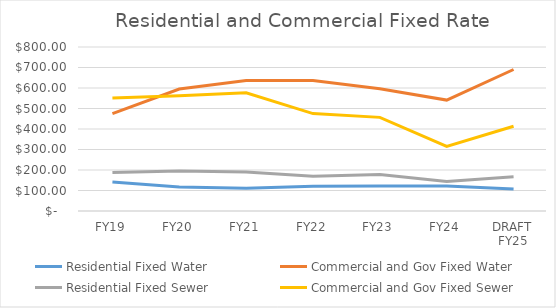
| Category | Residential Fixed Water | Commercial and Gov Fixed Water | Residential Fixed Sewer | Commercial and Gov Fixed Sewer |
|---|---|---|---|---|
| FY19 | 141.2 | 475.04 | 187.28 | 551.49 |
| FY20 | 116.517 | 594.717 | 194.637 | 562.561 |
| FY21 | 111.329 | 636.57 | 190.661 | 577.076 |
| FY22 | 120.447 | 636.618 | 169.72 | 475.045 |
| FY23 | 122.065 | 596.068 | 177.462 | 456.697 |
| FY24 | 121.869 | 541.026 | 144.338 | 315 |
| DRAFT FY25 | 107.28 | 690.29 | 167.49 | 413.45 |